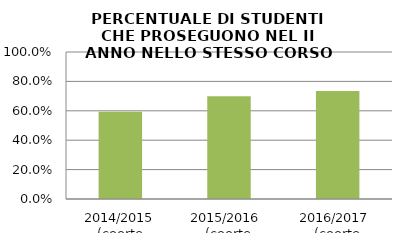
| Category | 2014/2015 (coorte 2013/14) 2015/2016  (coorte 2014/15) 2016/2017  (coorte 2015/16) |
|---|---|
| 2014/2015 (coorte 2013/14) | 0.593 |
| 2015/2016  (coorte 2014/15) | 0.699 |
| 2016/2017  (coorte 2015/16) | 0.734 |